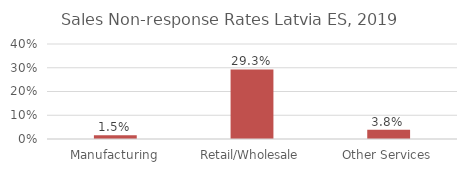
| Category | Series 0 |
|---|---|
| Manufacturing | 0.015 |
| Retail/Wholesale | 0.293 |
| Other Services | 0.038 |